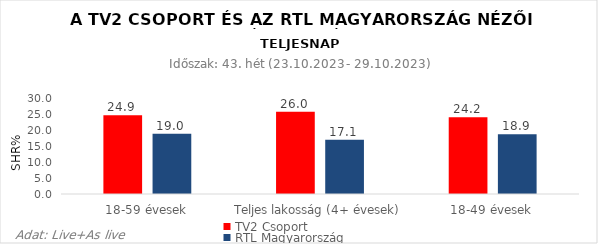
| Category | TV2 Csoport | RTL Magyarország |
|---|---|---|
| 18-59 évesek | 24.9 | 19 |
| Teljes lakosság (4+ évesek) | 26 | 17.1 |
| 18-49 évesek | 24.2 | 18.9 |